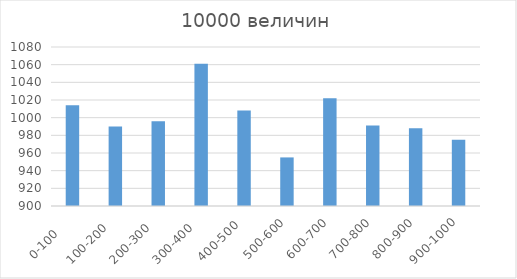
| Category | Series 0 |
|---|---|
| 0-100     | 1014 |
| 100-200   | 990 |
| 200-300   | 996 |
| 300-400   | 1061 |
| 400-500  | 1008 |
| 500-600 | 955 |
| 600-700 | 1022 |
| 700-800 | 991 |
| 800-900 | 988 |
| 900-1000 | 975 |